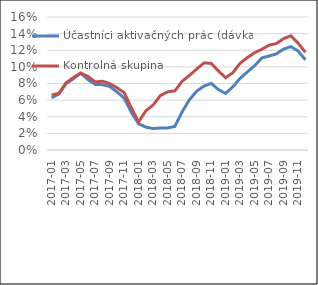
| Category | Účastníci aktivačných prác (dávka) | Kontrolná skupina |
|---|---|---|
| 2017-01 | 0.063 | 0.066 |
| 2017-02 | 0.067 | 0.068 |
| 2017-03 | 0.08 | 0.081 |
| 2017-04 | 0.086 | 0.087 |
| 2017-05 | 0.092 | 0.093 |
| 2017-06 | 0.085 | 0.089 |
| 2017-07 | 0.079 | 0.082 |
| 2017-08 | 0.079 | 0.083 |
| 2017-09 | 0.077 | 0.08 |
| 2017-10 | 0.07 | 0.075 |
| 2017-11 | 0.062 | 0.069 |
| 2017-12 | 0.045 | 0.051 |
| 2018-01 | 0.032 | 0.034 |
| 2018-02 | 0.027 | 0.047 |
| 2018-03 | 0.026 | 0.054 |
| 2018-04 | 0.026 | 0.066 |
| 2018-05 | 0.027 | 0.07 |
| 2018-06 | 0.028 | 0.071 |
| 2018-07 | 0.046 | 0.083 |
| 2018-08 | 0.06 | 0.09 |
| 2018-09 | 0.071 | 0.097 |
| 2018-10 | 0.077 | 0.105 |
| 2018-11 | 0.08 | 0.104 |
| 2018-12 | 0.073 | 0.095 |
| 2019-01 | 0.068 | 0.087 |
| 2019-02 | 0.076 | 0.093 |
| 2019-03 | 0.086 | 0.104 |
| 2019-04 | 0.094 | 0.111 |
| 2019-05 | 0.101 | 0.117 |
| 2019-06 | 0.111 | 0.121 |
| 2019-07 | 0.113 | 0.126 |
| 2019-08 | 0.116 | 0.128 |
| 2019-09 | 0.121 | 0.134 |
| 2019-10 | 0.124 | 0.137 |
| 2019-11 | 0.119 | 0.129 |
| 2019-12 | 0.108 | 0.118 |